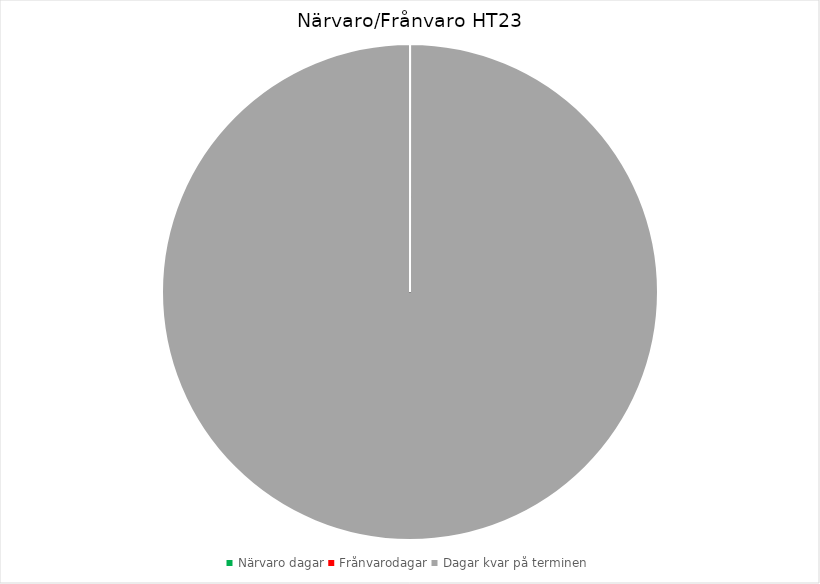
| Category | Series 0 |
|---|---|
| Närvaro dagar | 0 |
| Frånvarodagar | 0 |
| Dagar kvar på terminen | 105 |